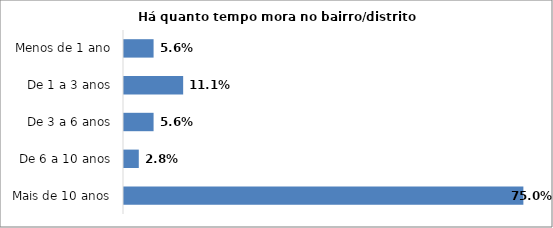
| Category | Series 0 |
|---|---|
| Mais de 10 anos | 0.75 |
| De 6 a 10 anos | 0.028 |
| De 3 a 6 anos | 0.056 |
| De 1 a 3 anos | 0.111 |
| Menos de 1 ano | 0.056 |